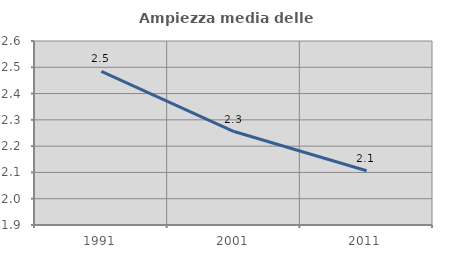
| Category | Ampiezza media delle famiglie |
|---|---|
| 1991.0 | 2.485 |
| 2001.0 | 2.256 |
| 2011.0 | 2.106 |